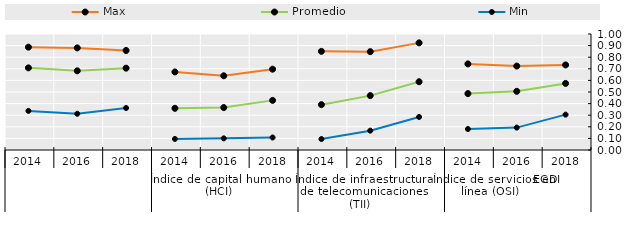
| Category | Max | Promedio | Min |
|---|---|---|---|
| 0 | 0.734 | 0.574 | 0.305 |
| 1 | 0.724 | 0.506 | 0.193 |
| 2 | 0.742 | 0.486 | 0.181 |
| 3 | 0.924 | 0.588 | 0.285 |
| 4 | 0.848 | 0.469 | 0.167 |
| 5 | 0.85 | 0.391 | 0.094 |
| 6 | 0.697 | 0.428 | 0.108 |
| 7 | 0.64 | 0.366 | 0.1 |
| 8 | 0.673 | 0.359 | 0.095 |
| 9 | 0.858 | 0.706 | 0.362 |
| 10 | 0.88 | 0.683 | 0.312 |
| 11 | 0.886 | 0.708 | 0.337 |